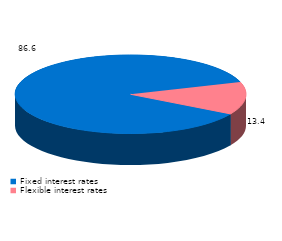
| Category | Series 0 |
|---|---|
| Fixed interest rates | 86.6 |
| Flexible interest rates | 13.4 |